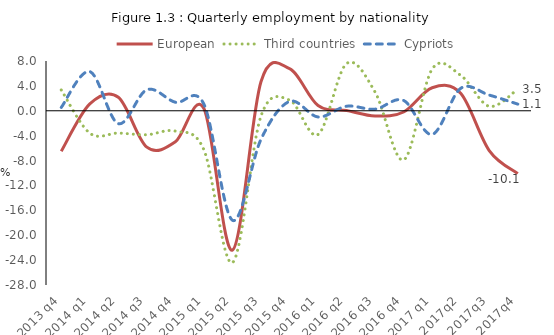
| Category | European | Third countries |
|---|---|---|
| 2013 q4 | -6.497 | 3.344 |
| 2014 q1 | 1.1 | -3.6 |
| 2014 q2 | 2.166 | -3.585 |
| 2014 q3 | -5.852 | -3.846 |
| 2014 q4 | -4.99 | -3.269 |
| 2015 q1 | 0.357 | -6.28 |
| 2015 q2 | -22.4 | -24.4 |
| 2015 q3 | 4.677 | -0.86 |
| 2015 q4 | 6.772 | 1.731 |
| 2016 q1 | 0.854 | -3.815 |
| 2016 q2 | 0.049 | 7.584 |
| 2016 q3 | -0.835 | 3.003 |
| 2016 q4 | -0.194 | -7.9 |
| 2017 q1 | 3.7 | 6.7 |
| 2017q2 | 2.8 | 5.7 |
| 2017q3 | -6.394 | 0.718 |
| 2017q4 | -10.103 | 3.476 |